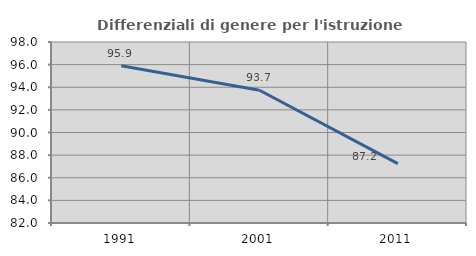
| Category | Differenziali di genere per l'istruzione superiore |
|---|---|
| 1991.0 | 95.897 |
| 2001.0 | 93.734 |
| 2011.0 | 87.246 |